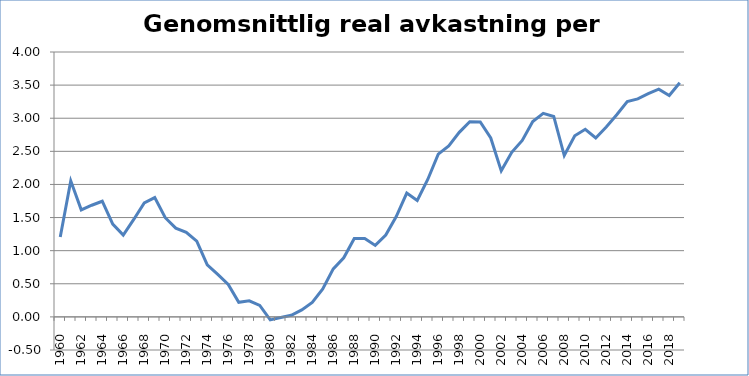
| Category | Genomsnittlig real  |
|---|---|
| 1960.0 | 1.207 |
| 1961.0 | 2.054 |
| 1962.0 | 1.616 |
| 1963.0 | 1.686 |
| 1964.0 | 1.746 |
| 1965.0 | 1.401 |
| 1966.0 | 1.234 |
| 1967.0 | 1.471 |
| 1968.0 | 1.721 |
| 1969.0 | 1.802 |
| 1970.0 | 1.498 |
| 1971.0 | 1.341 |
| 1972.0 | 1.278 |
| 1973.0 | 1.143 |
| 1974.0 | 0.785 |
| 1975.0 | 0.641 |
| 1976.0 | 0.49 |
| 1977.0 | 0.22 |
| 1978.0 | 0.243 |
| 1979.0 | 0.173 |
| 1980.0 | -0.046 |
| 1981.0 | -0.01 |
| 1982.0 | 0.024 |
| 1983.0 | 0.105 |
| 1984.0 | 0.219 |
| 1985.0 | 0.422 |
| 1986.0 | 0.724 |
| 1987.0 | 0.893 |
| 1988.0 | 1.183 |
| 1989.0 | 1.183 |
| 1990.0 | 1.079 |
| 1991.0 | 1.236 |
| 1992.0 | 1.514 |
| 1993.0 | 1.87 |
| 1994.0 | 1.759 |
| 1995.0 | 2.075 |
| 1996.0 | 2.457 |
| 1997.0 | 2.583 |
| 1998.0 | 2.787 |
| 1999.0 | 2.948 |
| 2000.0 | 2.944 |
| 2001.0 | 2.701 |
| 2002.0 | 2.205 |
| 2003.0 | 2.484 |
| 2004.0 | 2.665 |
| 2005.0 | 2.949 |
| 2006.0 | 3.074 |
| 2007.0 | 3.027 |
| 2008.0 | 2.437 |
| 2009.0 | 2.735 |
| 2010.0 | 2.832 |
| 2011.0 | 2.702 |
| 2012.0 | 2.866 |
| 2013.0 | 3.052 |
| 2014.0 | 3.25 |
| 2015.0 | 3.292 |
| 2016.0 | 3.37 |
| 2017.0 | 3.438 |
| 2018.0 | 3.343 |
| 2019.0 | 3.535 |